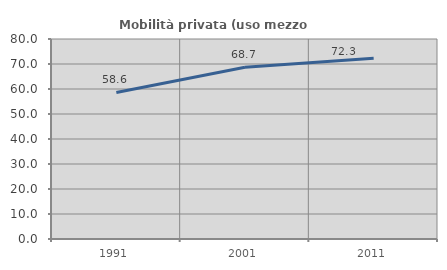
| Category | Mobilità privata (uso mezzo privato) |
|---|---|
| 1991.0 | 58.626 |
| 2001.0 | 68.694 |
| 2011.0 | 72.332 |